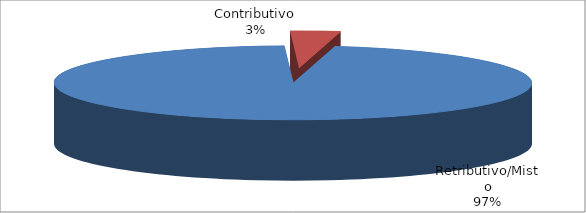
| Category | Series 1 |
|---|---|
| Retributivo/Misto | 24999 |
| Contributivo | 871 |